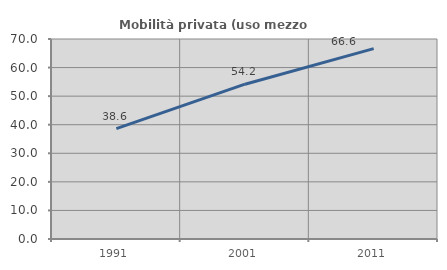
| Category | Mobilità privata (uso mezzo privato) |
|---|---|
| 1991.0 | 38.639 |
| 2001.0 | 54.18 |
| 2011.0 | 66.641 |